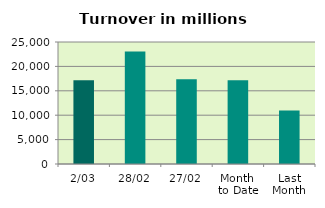
| Category | Series 0 |
|---|---|
| 2/03 | 17186.207 |
| 28/02 | 23051.554 |
| 27/02 | 17378.973 |
| Month 
to Date | 17186.207 |
| Last
Month | 10948.033 |